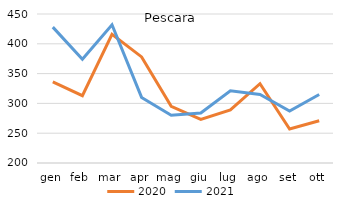
| Category | 2020 | 2021 |
|---|---|---|
| gen | 336 | 428 |
| feb | 313 | 374 |
| mar | 416 | 432 |
| apr | 378 | 310 |
| mag | 295 | 280 |
| giu | 273 | 284 |
| lug | 289 | 321 |
| ago | 333 | 315 |
| set | 257 | 287 |
| ott | 271 | 315 |